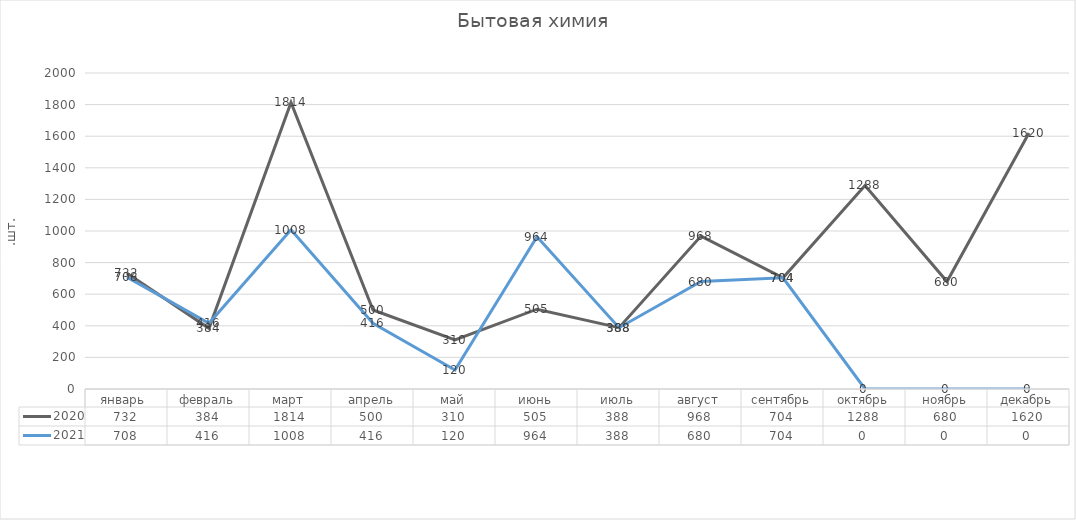
| Category | 2020 | 2021 |
|---|---|---|
| январь  | 732 | 708 |
| февраль | 384 | 416 |
| март | 1814 | 1008 |
| апрель | 500 | 416 |
| май | 310 | 120 |
| июнь | 505 | 964 |
| июль | 388 | 388 |
| август | 968 | 680 |
| сентябрь | 704 | 704 |
| октябрь | 1288 | 0 |
| ноябрь | 680 | 0 |
| декабрь | 1620 | 0 |